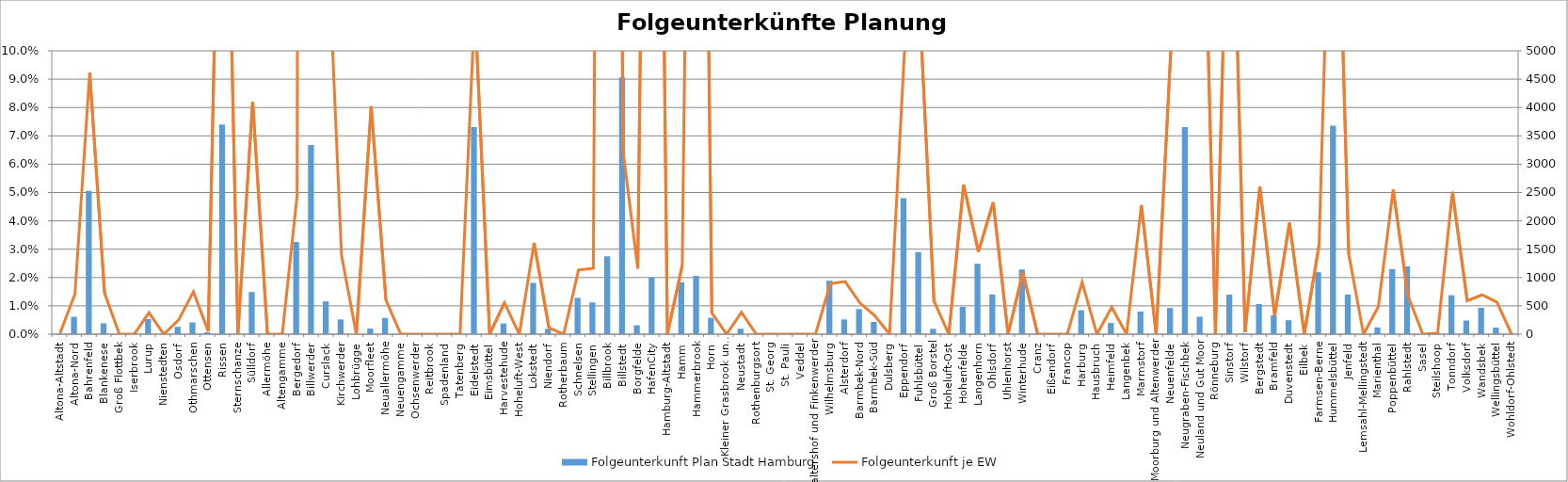
| Category | Folgeunterkunft Plan Stadt Hamburg |
|---|---|
| Altona-Altstadt | 12 |
| Altona-Nord | 307 |
| Bahrenfeld | 2527 |
| Blankenese | 192 |
| Groß Flottbek | 0 |
| Iserbrook | 0 |
| Lurup | 267 |
| Nienstedten | 0 |
| Osdorf | 130 |
| Othmarschen | 208 |
| Ottensen | 36 |
| Rissen | 3700 |
| Sternschanze | 0 |
| Sülldorf | 744 |
| Allermöhe | 0 |
| Altengamme | 0 |
| Bergedorf | 1626 |
| Billwerder | 3340 |
| Curslack | 580 |
| Kirchwerder | 260 |
| Lohbrügge | 0 |
| Moorfleet | 100 |
| Neuallermöhe | 287 |
| Neuengamme | 0 |
| Ochsenwerder | 0 |
| Reitbrook | 0 |
| Spadenland | 0 |
| Tatenberg | 0 |
| Eidelstedt | 3654 |
| Eimsbüttel | 0 |
| Harvestehude | 190 |
| Hoheluft-West | 0 |
| Lokstedt | 905 |
| Niendorf | 92 |
| Rotherbaum | 0 |
| Schnelsen | 641 |
| Stellingen | 561 |
| Billbrook | 1374 |
| Billstedt | 4530 |
| Borgfelde | 157 |
| HafenCity | 1000 |
| Hamburg-Altstadt | 0 |
| Hamm | 918 |
| Hammerbrook | 1028 |
| Horn | 288 |
| Kleiner Grasbrook und Steinwerder | 0 |
| Neustadt | 96 |
| Rothenburgsort | 0 |
| St. Georg | 0 |
| St. Pauli | 0 |
| Veddel | 0 |
| Waltershof und Finkenwerder | 0 |
| Wilhelmsburg | 944 |
| Alsterdorf | 260 |
| Barmbek-Nord | 443 |
| Barmbek-Süd | 216 |
| Dulsberg | 0 |
| Eppendorf | 2400 |
| Fuhlsbüttel | 1451 |
| Groß Borstel | 94 |
| Hoheluft-Ost | 0 |
| Hohenfelde | 484 |
| Langenhorn | 1243 |
| Ohlsdorf | 700 |
| Uhlenhorst | 0 |
| Winterhude | 1142 |
| Cranz | 0 |
| Eißendorf | 0 |
| Francop | 0 |
| Harburg | 422 |
| Hausbruch | 0 |
| Heimfeld | 198 |
| Langenbek | 0 |
| Marmstorf | 400 |
| Moorburg und Altenwerder | 0 |
| Neuenfelde | 462 |
| Neugraben-Fischbek | 3654 |
| Neuland und Gut Moor | 308 |
| Rönneburg | 0 |
| Sinstorf | 697 |
| Wilstorf | 12 |
| Bergstedt | 532 |
| Bramfeld | 331 |
| Duvenstedt | 246 |
| Eilbek | 0 |
| Farmsen-Berne | 1094 |
| Hummelsbüttel | 3680 |
| Jenfeld | 700 |
| Lemsahl-Mellingstedt | 0 |
| Marienthal | 120 |
| Poppenbüttel | 1150 |
| Rahlstedt | 1198 |
| Sasel | 0 |
| Steilshoop | 6 |
| Tonndorf | 688 |
| Volksdorf | 241 |
| Wandsbek | 466 |
| Wellingsbüttel | 118 |
| Wohldorf-Ohlstedt | 0 |